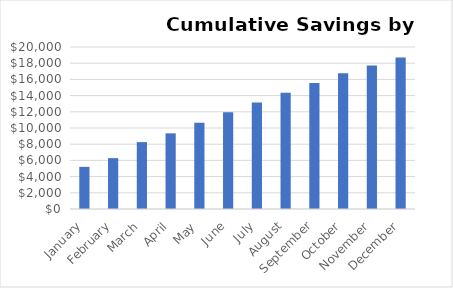
| Category | CUMULATIVE SAVINGS |
|---|---|
| January | 5204.2 |
| February | 6281.9 |
| March | 8259.6 |
| April | 9338.8 |
| May | 10641 |
| June | 11943.2 |
| July | 13145.4 |
| August | 14347.6 |
| September | 15549.8 |
| October | 16752 |
| November | 17731.2 |
| December | 18710.4 |